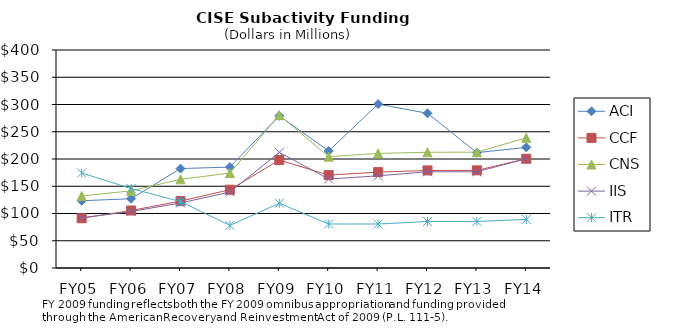
| Category | ACI | CCF | CNS | IIS | ITR |
|---|---|---|---|---|---|
| FY05 | 123.4 | 91.29 | 132.17 | 92.31 | 174.43 |
| FY06 | 127.14 | 105.46 | 141.53 | 103.62 | 145.8 |
| FY07 | 182.42 | 122.76 | 162.77 | 119.25 | 121.9 |
| FY08 | 185.15 | 143.63 | 174.16 | 139.33 | 78.14 |
| FY09 | 279.23 | 198.09 | 280.55 | 212.1 | 118.76 |
| FY10 | 214.72 | 170.398 | 204.325 | 163.213 | 80.78 |
| FY11 | 300.75 | 175.932 | 210.258 | 169.143 | 80.73 |
| FY12 | 283.84 | 179.03 | 212.36 | 176.58 | 85.35 |
| FY13 | 211.64 | 179.13 | 212.5 | 176.5 | 85.46 |
| FY14 | 221.35 | 200.46 | 238.87 | 200.42 | 89.15 |